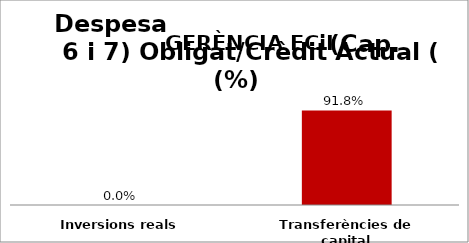
| Category | Series 0 |
|---|---|
| Inversions reals | 0 |
| Transferències de capital | 0.918 |